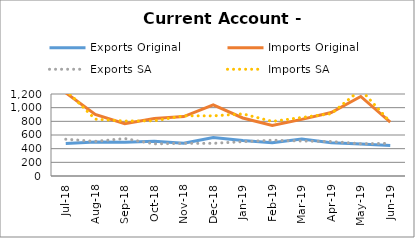
| Category | Exports Original | Imports Original | Exports SA | Imports SA |
|---|---|---|---|---|
| 2018-07-11 | 477 | 1218 | 538 | 1256 |
| 2018-08-11 | 499 | 901 | 507 | 832 |
| 2018-09-11 | 495 | 764 | 548 | 804 |
| 2018-10-11 | 508 | 841 | 470 | 807 |
| 2018-11-11 | 478 | 870 | 478 | 881 |
| 2018-12-11 | 563 | 1041 | 478 | 880 |
| 2019-01-11 | 519 | 849 | 502 | 909 |
| 2019-02-11 | 485 | 741 | 524 | 799 |
| 2019-03-11 | 542 | 829 | 512 | 856 |
| 2019-04-11 | 486 | 928 | 505 | 912 |
| 2019-05-11 | 468 | 1164 | 472 | 1264 |
| 2019-06-11 | 446 | 790 | 478 | 790 |